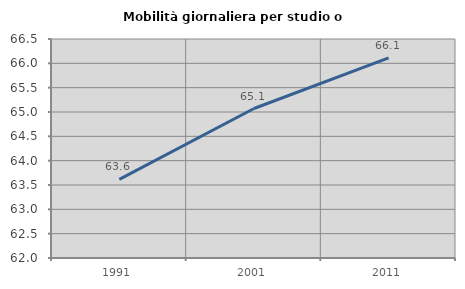
| Category | Mobilità giornaliera per studio o lavoro |
|---|---|
| 1991.0 | 63.615 |
| 2001.0 | 65.071 |
| 2011.0 | 66.113 |